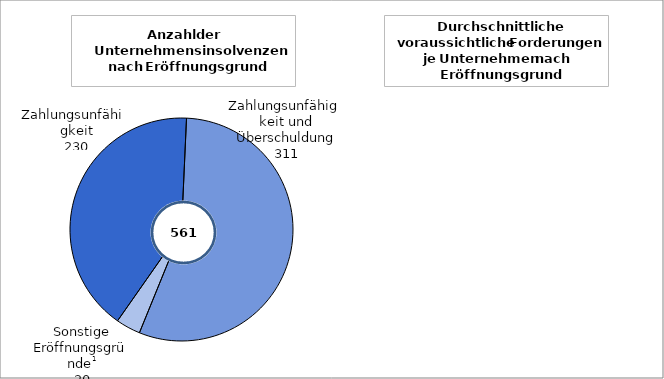
| Category | Series 0 | Series 1 |
|---|---|---|
| Zahlungsunfähigkeit | 230 | 203 |
|   Zahlungsunfähigkeit
   und Überschuldung | 311 | 2436 |
|  Sonstige Eröffnungs-
                      gründe 2 | 20 | 1895 |